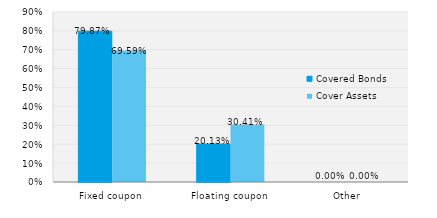
| Category | Covered Bonds | Cover Assets |
|---|---|---|
| Fixed coupon | 0.799 | 0.696 |
| Floating coupon | 0.201 | 0.304 |
| Other | 0 | 0 |